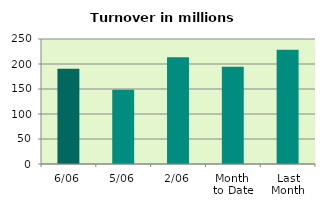
| Category | Series 0 |
|---|---|
| 6/06 | 190.274 |
| 5/06 | 148.575 |
| 2/06 | 213.416 |
| Month 
to Date | 194.391 |
| Last
Month | 228.645 |